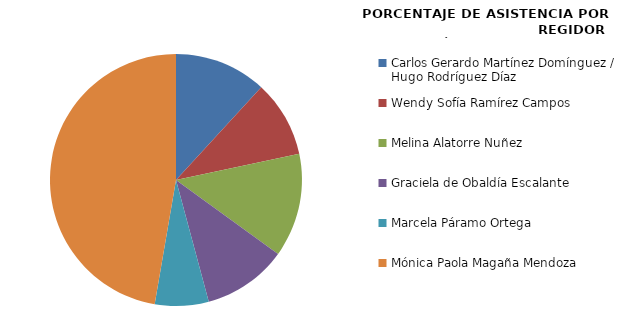
| Category | Series 0 |
|---|---|
| Carlos Gerardo Martínez Domínguez /
Hugo Rodríguez Díaz  | 100 |
| Wendy Sofía Ramírez Campos | 83.333 |
| Melina Alatorre Nuñez | 112.5 |
| Graciela de Obaldía Escalante | 91.667 |
| Marcela Páramo Ortega | 58.333 |
| Mónica Paola Magaña Mendoza | 400 |